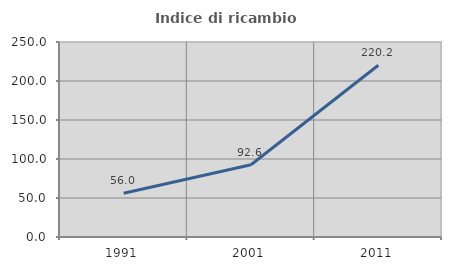
| Category | Indice di ricambio occupazionale  |
|---|---|
| 1991.0 | 56.037 |
| 2001.0 | 92.613 |
| 2011.0 | 220.247 |